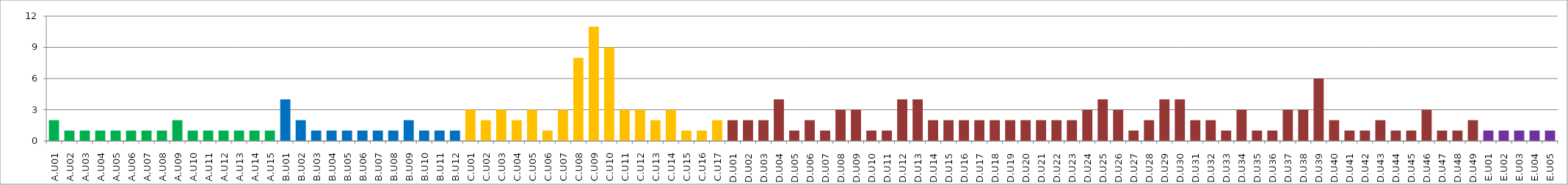
| Category | Series 0 |
|---|---|
| A.U01 | 2 |
| A.U02 | 1 |
| A.U03 | 1 |
| A.U04 | 1 |
| A.U05 | 1 |
| A.U06 | 1 |
| A.U07 | 1 |
| A.U08 | 1 |
| A.U09 | 2 |
| A.U10 | 1 |
| A.U11 | 1 |
| A.U12 | 1 |
| A.U13 | 1 |
| A.U14 | 1 |
| A.U15 | 1 |
| B.U01 | 4 |
| B.U02 | 2 |
| B.U03 | 1 |
| B.U04 | 1 |
| B.U05 | 1 |
| B.U06 | 1 |
| B.U07 | 1 |
| B.U08 | 1 |
| B.U09 | 2 |
| B.U10 | 1 |
| B.U11 | 1 |
| B.U12 | 1 |
| C.U01 | 3 |
| C.U02 | 2 |
| C.U03 | 3 |
| C.U04 | 2 |
| C.U05 | 3 |
| C.U06 | 1 |
| C.U07 | 3 |
| C.U08 | 8 |
| C.U09 | 11 |
| C.U10 | 9 |
| C.U11 | 3 |
| C.U12 | 3 |
| C.U13 | 2 |
| C.U14 | 3 |
| C.U15 | 1 |
| C.U16 | 1 |
| C.U17 | 2 |
| D.U01 | 2 |
| D.U02 | 2 |
| D.U03 | 2 |
| D.U04 | 4 |
| D.U05 | 1 |
| D.U06 | 2 |
| D.U07 | 1 |
| D.U08 | 3 |
| D.U09 | 3 |
| D.U10 | 1 |
| D.U11 | 1 |
| D.U12 | 4 |
| D.U13 | 4 |
| D.U14 | 2 |
| D.U15 | 2 |
| D.U16 | 2 |
| D.U17 | 2 |
| D.U18 | 2 |
| D.U19 | 2 |
| D.U20 | 2 |
| D.U21 | 2 |
| D.U22 | 2 |
| D.U23 | 2 |
| D.U24 | 3 |
| D.U25 | 4 |
| D.U26 | 3 |
| D.U27 | 1 |
| D.U28 | 2 |
| D.U29 | 4 |
| D.U30 | 4 |
| D.U31 | 2 |
| D.U32 | 2 |
| D.U33 | 1 |
| D.U34 | 3 |
| D.U35 | 1 |
| D.U36 | 1 |
| D.U37 | 3 |
| D.U38 | 3 |
| D.U39 | 6 |
| D.U40 | 2 |
| D.U41 | 1 |
| D.U42 | 1 |
| D.U43 | 2 |
| D.U44 | 1 |
| D.U45 | 1 |
| D.U46 | 3 |
| D.U47 | 1 |
| D.U48 | 1 |
| D.U49 | 2 |
| E.U01 | 1 |
| E.U02 | 1 |
| E.U03 | 1 |
| E.U04 | 1 |
| E.U05 | 1 |